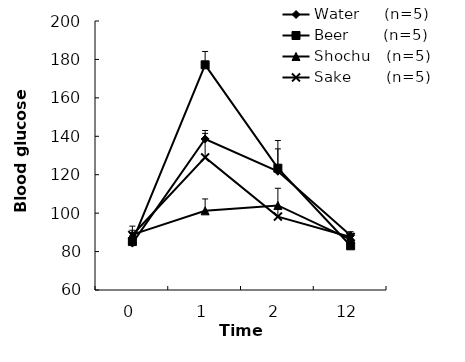
| Category | Water     (n=5) | Beer       (n=5) | Shochu   (n=5) | Sake       (n=5) |
|---|---|---|---|---|
| 0.0 | 84.4 | 85.2 | 88.8 | 88.6 |
| 1.0 | 138.6 | 177.2 | 101.2 | 129 |
| 2.0 | 121.8 | 123.4 | 104 | 98.2 |
| 12.0 | 88.4 | 83 | 86.2 | 87.6 |